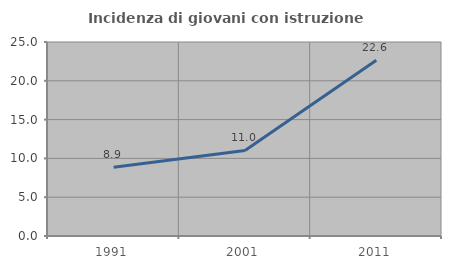
| Category | Incidenza di giovani con istruzione universitaria |
|---|---|
| 1991.0 | 8.859 |
| 2001.0 | 11.02 |
| 2011.0 | 22.642 |